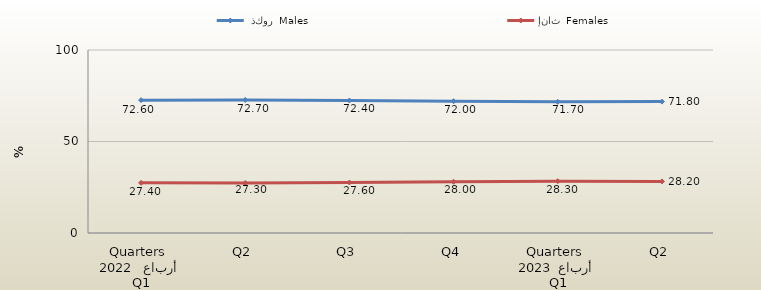
| Category |  ذكور  Males | إناث  Females |
|---|---|---|
| 0 | 72.6 | 27.4 |
| 1 | 72.7 | 27.3 |
| 2 | 72.4 | 27.6 |
| 3 | 72 | 28 |
| 4 | 71.7 | 28.3 |
| 5 | 71.8 | 28.2 |